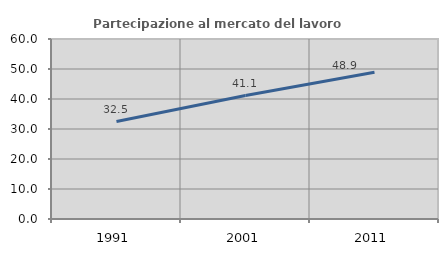
| Category | Partecipazione al mercato del lavoro  femminile |
|---|---|
| 1991.0 | 32.5 |
| 2001.0 | 41.139 |
| 2011.0 | 48.889 |